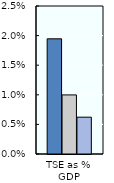
| Category | 1986-88 | 2000-02 | 2018-20 |
|---|---|---|---|
| TSE as % GDP | 0.019 | 0.01 | 0.006 |